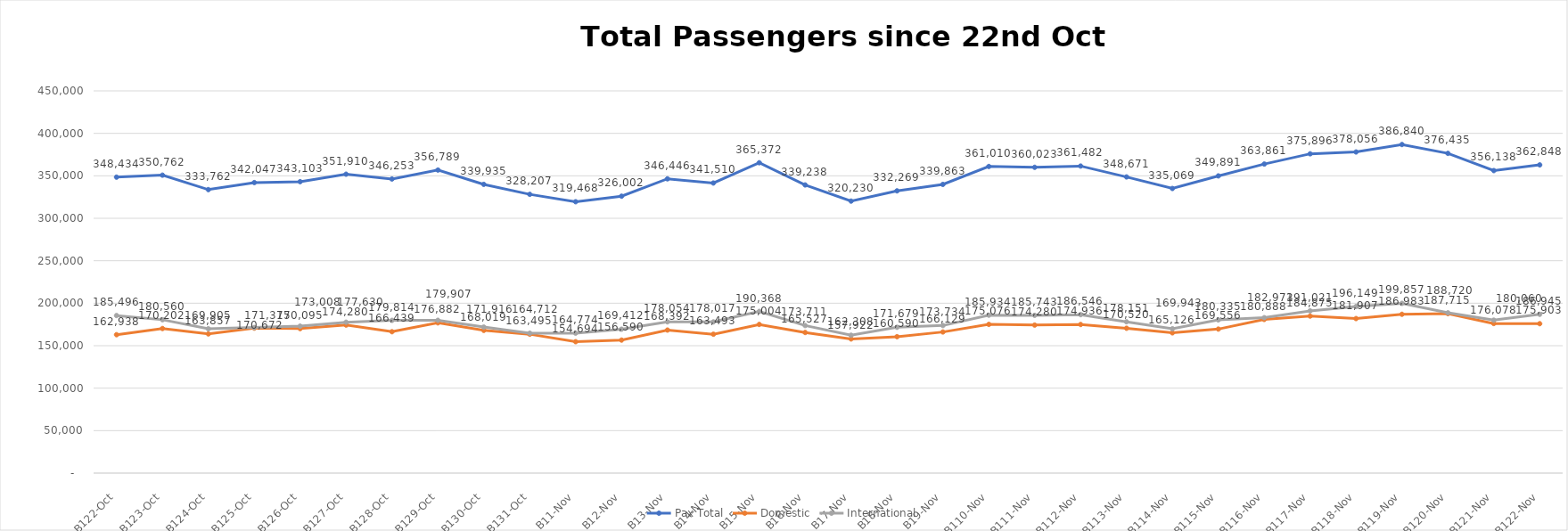
| Category | Pax Total | Domestic | International |
|---|---|---|---|
| 2023-10-22 | 348434 | 162938 | 185496 |
| 2023-10-23 | 350762 | 170202 | 180560 |
| 2023-10-24 | 333762 | 163857 | 169905 |
| 2023-10-25 | 342047 | 170672 | 171375 |
| 2023-10-26 | 343103 | 170095 | 173008 |
| 2023-10-27 | 351910 | 174280 | 177630 |
| 2023-10-28 | 346253 | 166439 | 179814 |
| 2023-10-29 | 356789 | 176882 | 179907 |
| 2023-10-30 | 339935 | 168019 | 171916 |
| 2023-10-31 | 328207 | 163495 | 164712 |
| 2023-11-01 | 319468 | 154694 | 164774 |
| 2023-11-02 | 326002 | 156590 | 169412 |
| 2023-11-03 | 346446 | 168392 | 178054 |
| 2023-11-04 | 341510 | 163493 | 178017 |
| 2023-11-05 | 365372 | 175004 | 190368 |
| 2023-11-06 | 339238 | 165527 | 173711 |
| 2023-11-07 | 320230 | 157922 | 162308 |
| 2023-11-08 | 332269 | 160590 | 171679 |
| 2023-11-09 | 339863 | 166129 | 173734 |
| 2023-11-10 | 361010 | 175076 | 185934 |
| 2023-11-11 | 360023 | 174280 | 185743 |
| 2023-11-12 | 361482 | 174936 | 186546 |
| 2023-11-13 | 348671 | 170520 | 178151 |
| 2023-11-14 | 335069 | 165126 | 169943 |
| 2023-11-15 | 349891 | 169556 | 180335 |
| 2023-11-16 | 363861 | 180888 | 182973 |
| 2023-11-17 | 375896 | 184875 | 191021 |
| 2023-11-18 | 378056 | 181907 | 196149 |
| 2023-11-19 | 386840 | 186983 | 199857 |
| 2023-11-20 | 376435 | 187715 | 188720 |
| 2023-11-21 | 356138 | 176078 | 180060 |
| 2023-11-22 | 362848 | 175903 | 186945 |